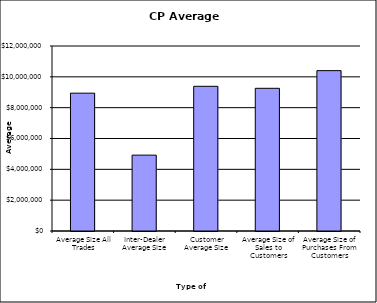
| Category | Security Type |
|---|---|
| Average Size All Trades | 8940981.162 |
| Inter-Dealer Average Size | 4921251.969 |
| Customer Average Size | 9386060.157 |
| Average Size of Sales to Customers | 9256155.359 |
| Average Size of Purchases From Customers | 10402315.385 |